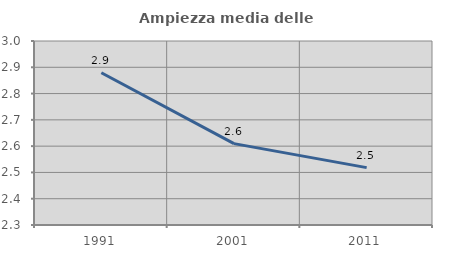
| Category | Ampiezza media delle famiglie |
|---|---|
| 1991.0 | 2.879 |
| 2001.0 | 2.61 |
| 2011.0 | 2.518 |